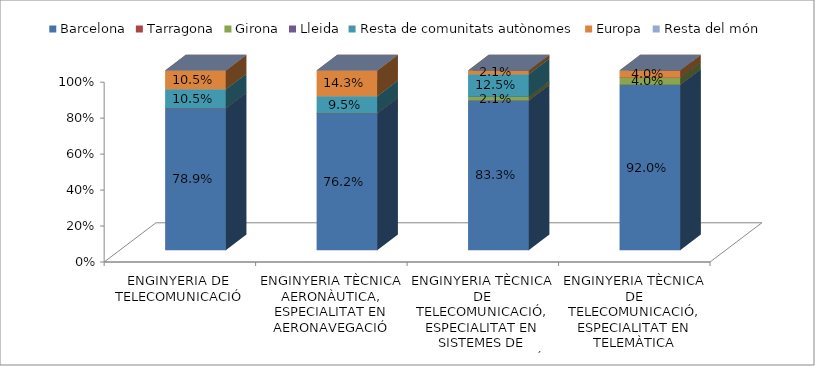
| Category | Barcelona | Tarragona | Girona | Lleida | Resta de comunitats autònomes | Europa | Resta del món |
|---|---|---|---|---|---|---|---|
| ENGINYERIA DE TELECOMUNICACIÓ | 0.789 | 0 | 0 | 0 | 0.105 | 0.105 | 0 |
| ENGINYERIA TÈCNICA AERONÀUTICA, ESPECIALITAT EN AERONAVEGACIÓ | 0.762 | 0 | 0 | 0 | 0.095 | 0.143 | 0 |
| ENGINYERIA TÈCNICA DE TELECOMUNICACIÓ, ESPECIALITAT EN SISTEMES DE TELECOMUNICACIÓ | 0.833 | 0 | 0.021 | 0 | 0.125 | 0.021 | 0 |
| ENGINYERIA TÈCNICA DE TELECOMUNICACIÓ, ESPECIALITAT EN TELEMÀTICA | 0.92 | 0 | 0.04 | 0 | 0 | 0.04 | 0 |